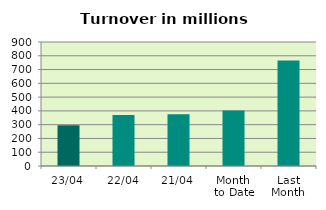
| Category | Series 0 |
|---|---|
| 23/04 | 295.602 |
| 22/04 | 369.72 |
| 21/04 | 375.709 |
| Month 
to Date | 403.324 |
| Last
Month | 765.33 |